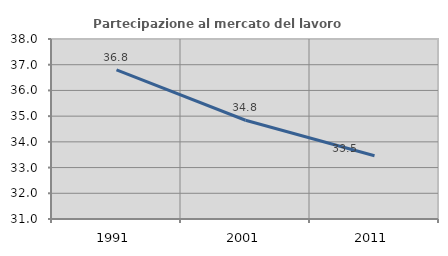
| Category | Partecipazione al mercato del lavoro  femminile |
|---|---|
| 1991.0 | 36.8 |
| 2001.0 | 34.84 |
| 2011.0 | 33.459 |